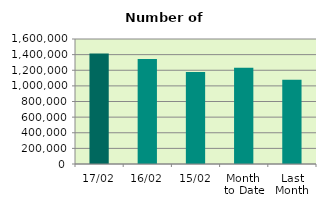
| Category | Series 0 |
|---|---|
| 17/02 | 1412920 |
| 16/02 | 1342698 |
| 15/02 | 1177522 |
| Month 
to Date | 1232348.154 |
| Last
Month | 1077187.636 |